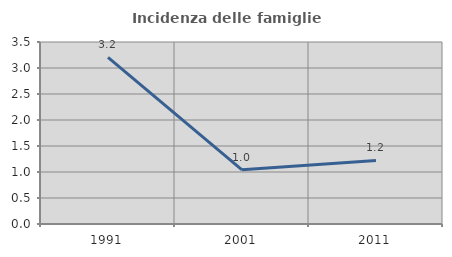
| Category | Incidenza delle famiglie numerose |
|---|---|
| 1991.0 | 3.203 |
| 2001.0 | 1.042 |
| 2011.0 | 1.222 |